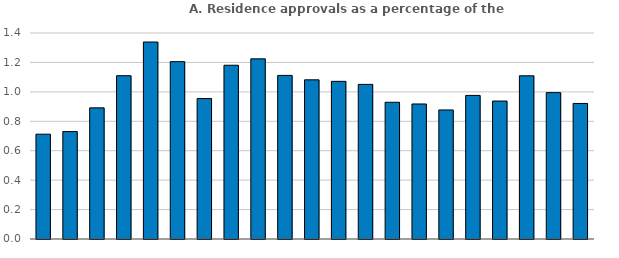
| Category | % of population |
|---|---|
|  | 0.712 |
|  | 0.73 |
|  | 0.891 |
|  | 1.11 |
|  | 1.339 |
|  | 1.205 |
|  | 0.955 |
|  | 1.181 |
|  | 1.224 |
|  | 1.112 |
|  | 1.082 |
|  | 1.071 |
|  | 1.051 |
|  | 0.929 |
|  | 0.918 |
|  | 0.877 |
|  | 0.976 |
|  | 0.938 |
|  | 1.109 |
|  | 0.995 |
|  | 0.921 |